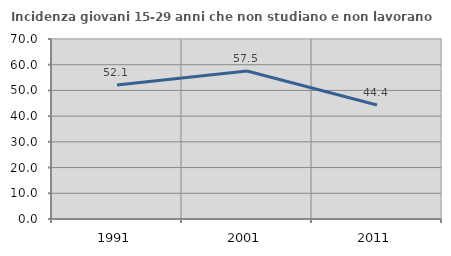
| Category | Incidenza giovani 15-29 anni che non studiano e non lavorano  |
|---|---|
| 1991.0 | 52.083 |
| 2001.0 | 57.528 |
| 2011.0 | 44.357 |